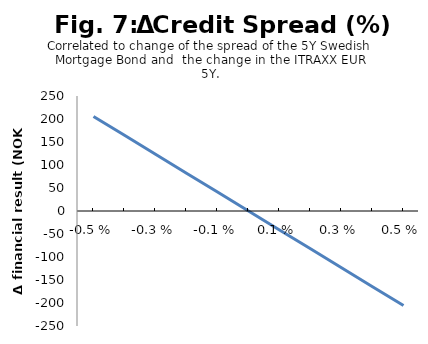
| Category | Series 0 |
|---|---|
| -0.005 | 205.588 |
| -0.004 | 164.471 |
| -0.003 | 123.353 |
| -0.002 | 82.235 |
| -0.001 | 41.118 |
| 0.0 | 0 |
| 0.001 | -41.118 |
| 0.002 | -82.235 |
| 0.003 | -123.353 |
| 0.004 | -164.471 |
| 0.005 | -205.588 |